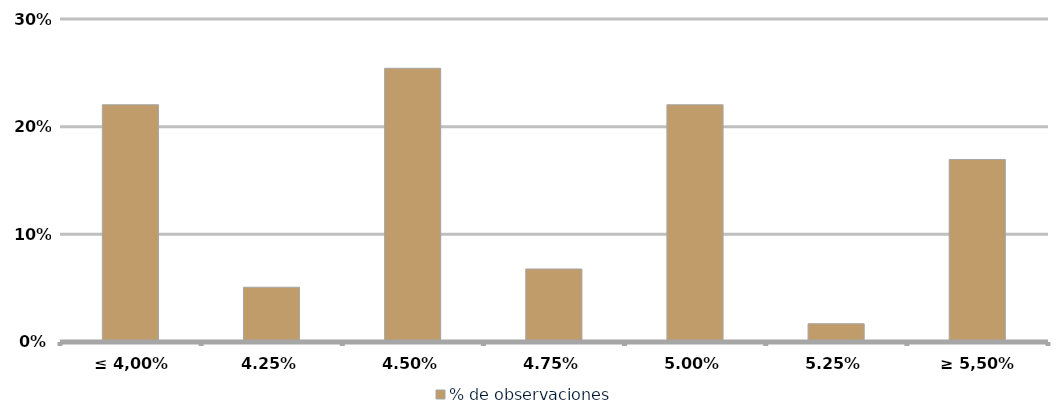
| Category | % de observaciones  |
|---|---|
| ≤ 4,00% | 0.22 |
| 4,25% | 0.051 |
| 4,50% | 0.254 |
| 4,75% | 0.068 |
| 5,00% | 0.22 |
| 5,25% | 0.017 |
| ≥ 5,50% | 0.169 |